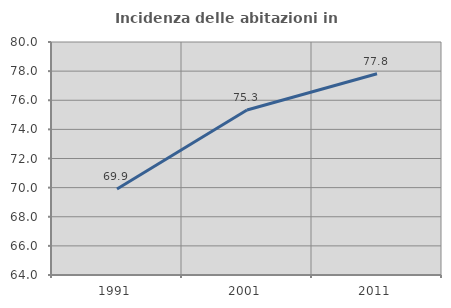
| Category | Incidenza delle abitazioni in proprietà  |
|---|---|
| 1991.0 | 69.911 |
| 2001.0 | 75.33 |
| 2011.0 | 77.818 |